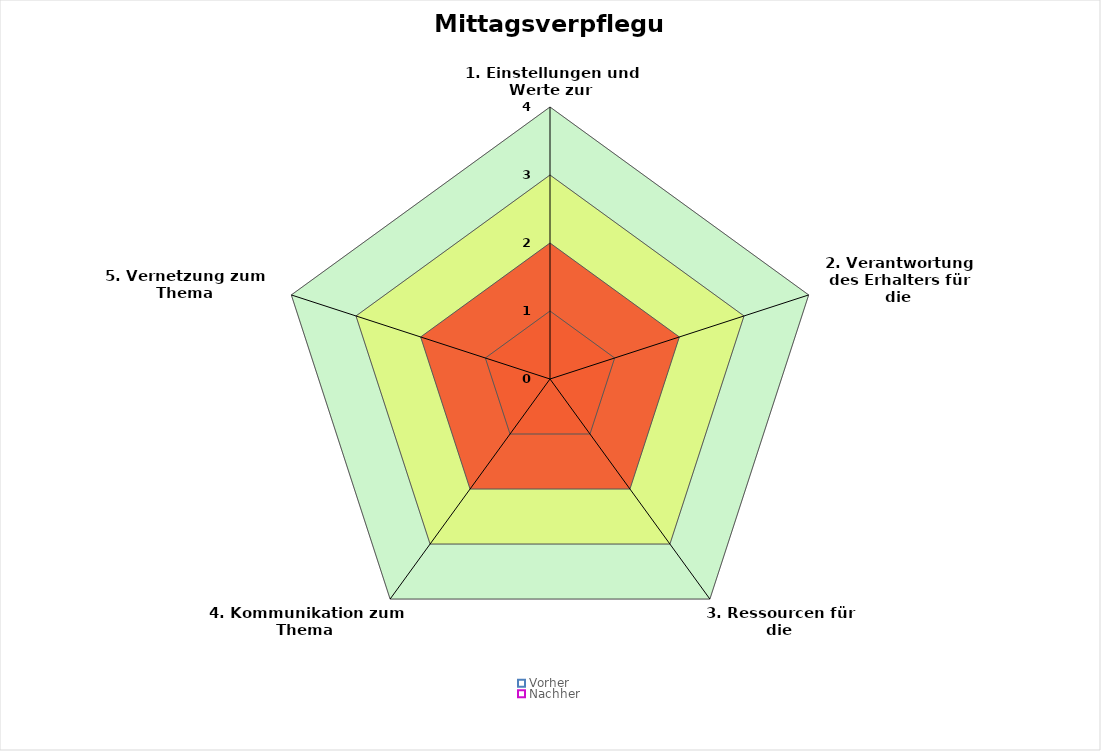
| Category | F4 | F3 | F2 | F1 | Vorher | Nachher |
|---|---|---|---|---|---|---|
| 1. Einstellungen und Werte zur Mittagsverpflegung | 4 | 3 | 2 | 1 | 0 | 0 |
| 2. Verantwortung des Erhalters für die Mittagsverpflegung | 4 | 3 | 2 | 1 | 0 | 0 |
| 3. Ressourcen für die Mittagsverpflegung | 4 | 3 | 2 | 1 | 0 | 0 |
| 4. Kommunikation zum Thema Mittagsverpflegung | 4 | 3 | 2 | 1 | 0 | 0 |
| 5. Vernetzung zum Thema Mittagsverpflegung | 4 | 3 | 2 | 1 | 0 | 0 |